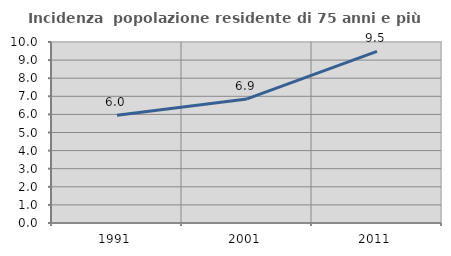
| Category | Incidenza  popolazione residente di 75 anni e più |
|---|---|
| 1991.0 | 5.959 |
| 2001.0 | 6.856 |
| 2011.0 | 9.477 |